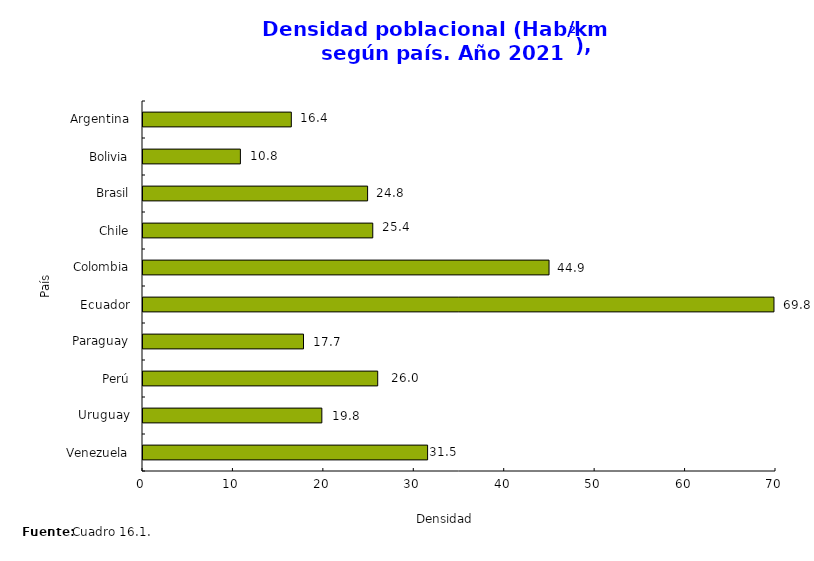
| Category | Densidad Poblacional (Hab/km²) |
|---|---|
| Venezuela | 31.473 |
| Uruguay | 19.778 |
| Perú | 25.956 |
| Paraguay | 17.749 |
| Ecuador | 69.776 |
| Colombia | 44.901 |
| Chile | 25.41 |
| Brasil | 24.837 |
| Bolivia | 10.771 |
| Argentina | 16.403 |